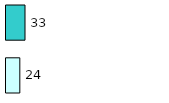
| Category | Series 0 | Series 1 |
|---|---|---|
| 0 | 24 | 33 |